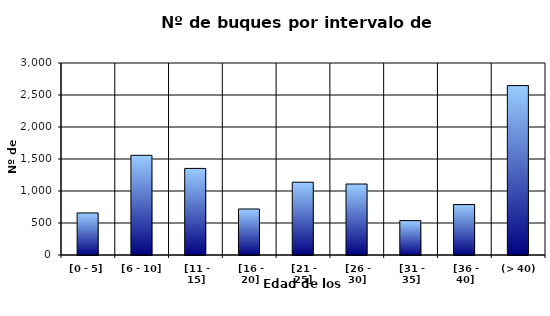
| Category | [0 - 5] |
|---|---|
| [0 - 5] | 657 |
|  [6 - 10] | 1558 |
|  [11 - 15] | 1353 |
|  [16 - 20] | 719 |
|  [21 - 25] | 1137 |
|  [26 - 30] | 1109 |
|  [31 - 35] | 537 |
|  [36 - 40] | 788 |
|  (> 40) | 2647 |